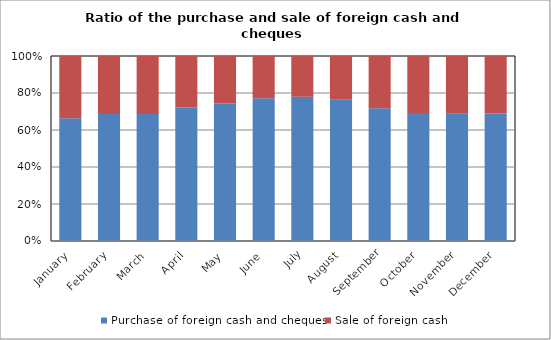
| Category | Purchase of foreign cash and cheques | Sale of foreign cash  |
|---|---|---|
| January | 1090340045 | 551698079 |
| February | 980011582 | 447286680 |
| March | 1217532027 | 556033862 |
| April | 1546159839 | 596603188 |
| May | 1731143242 | 598657862 |
| June | 2137910745 | 631722946 |
| July | 3119366330 | 882262893 |
| August | 3436460090 | 1066196079 |
| September | 1869385965 | 734356399 |
| October | 1349217768 | 602411624 |
| November | 1176185369 | 533365532 |
| December | 1289642674 | 580067435 |